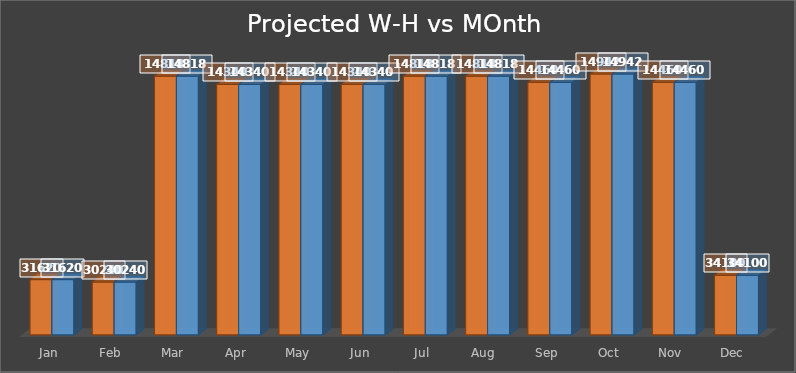
| Category | Series 1 | Series 0 |
|---|---|---|
| Jan | 31620 | 31620 |
| Feb | 30240 | 30240 |
| Mar | 148180 | 148180 |
| Apr | 143400 | 143400 |
| May | 143400 | 143400 |
| Jun | 143400 | 143400 |
| Jul | 148180 | 148180 |
| Aug | 148180 | 148180 |
| Sep | 144600 | 144600 |
| Oct | 149420 | 149420 |
| Nov | 144600 | 144600 |
| Dec | 34100 | 34100 |